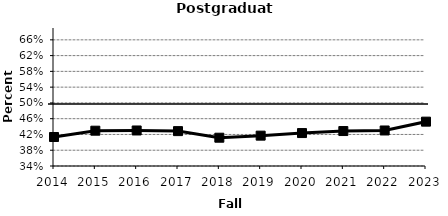
| Category | Series 1 |
|---|---|
| 2014.0 | 0.414 |
| 2015.0 | 0.43 |
| 2016.0 | 0.43 |
| 2017.0 | 0.428 |
| 2018.0 | 0.412 |
| 2019.0 | 0.417 |
| 2020.0 | 0.424 |
| 2021.0 | 0.429 |
| 2022.0 | 0.43 |
| 2023.0 | 0.452 |